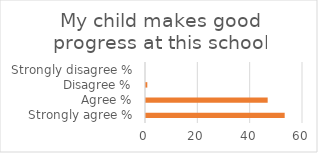
| Category | Series 1 |
|---|---|
| Strongly agree % | 53 |
| Agree % | 46.5 |
| Disagree % | 0.5 |
| Strongly disagree % | 0 |